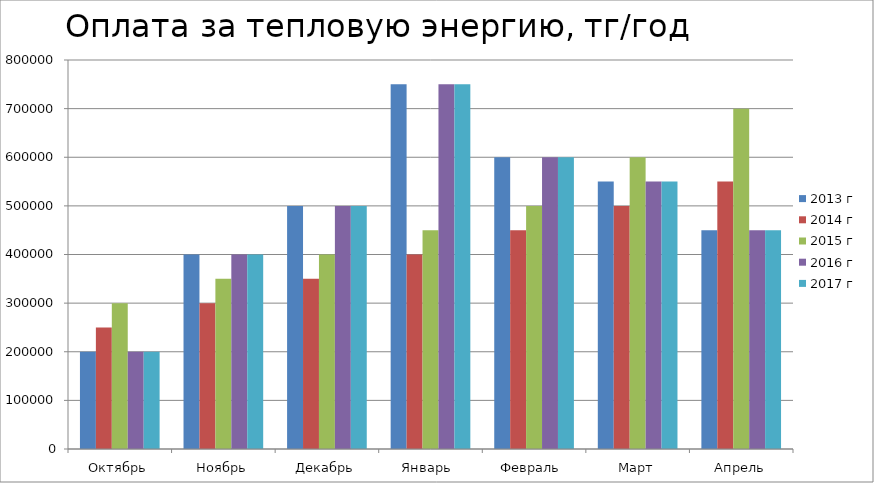
| Category | 2013 г | 2014 г | 2015 г | 2016 г | 2017 г |
|---|---|---|---|---|---|
| Октябрь | 200000 | 250000 | 300000 | 200000 | 200000 |
| Ноябрь | 400000 | 300000 | 350000 | 400000 | 400000 |
| Декабрь | 500000 | 350000 | 400000 | 500000 | 500000 |
| Январь  | 750000 | 400000 | 450000 | 750000 | 750000 |
| Февраль  | 600000 | 450000 | 500000 | 600000 | 600000 |
| Март | 550000 | 500000 | 600000 | 550000 | 550000 |
| Апрель | 450000 | 550000 | 700000 | 450000 | 450000 |